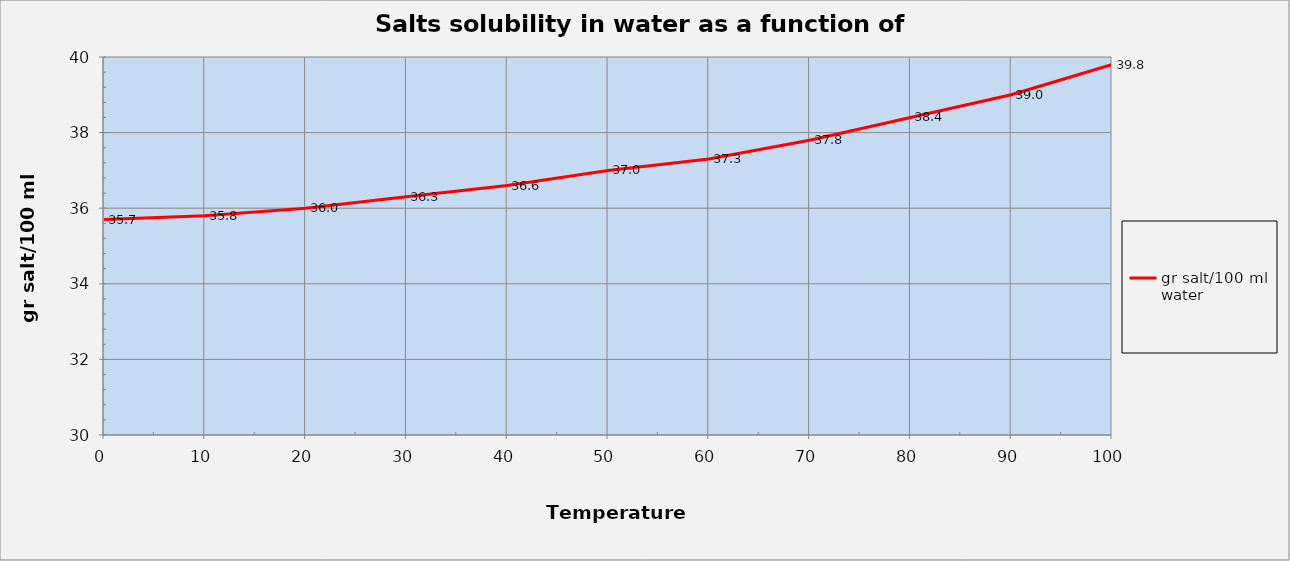
| Category | gr salt/100 ml water |
|---|---|
| 0.0 | 35.7 |
| 10.0 | 35.8 |
| 20.0 | 36 |
| 30.0 | 36.3 |
| 40.0 | 36.6 |
| 50.0 | 37 |
| 60.0 | 37.3 |
| 70.0 | 37.8 |
| 80.0 | 38.4 |
| 90.0 | 39 |
| 100.0 | 39.8 |